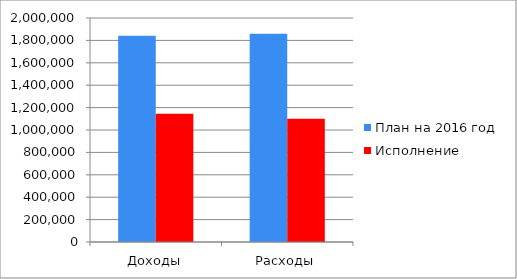
| Category | План на 2016 год | Исполнение |
|---|---|---|
| Доходы | 1841881 | 1145551 |
| Расходы | 1859137 | 1100394 |